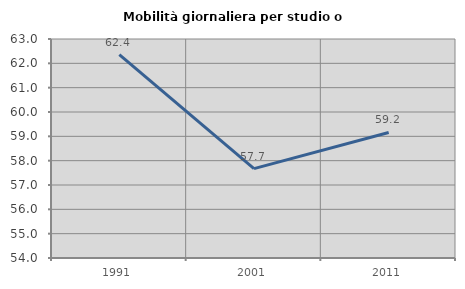
| Category | Mobilità giornaliera per studio o lavoro |
|---|---|
| 1991.0 | 62.361 |
| 2001.0 | 57.673 |
| 2011.0 | 59.159 |